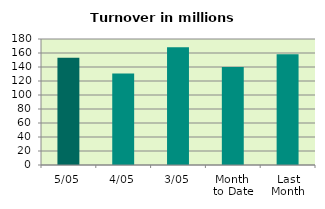
| Category | Series 0 |
|---|---|
| 5/05 | 153.368 |
| 4/05 | 130.686 |
| 3/05 | 168.057 |
| Month 
to Date | 140.001 |
| Last
Month | 158.303 |